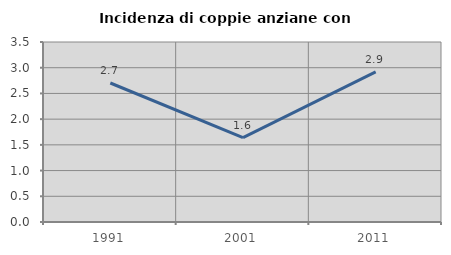
| Category | Incidenza di coppie anziane con figli |
|---|---|
| 1991.0 | 2.703 |
| 2001.0 | 1.639 |
| 2011.0 | 2.918 |